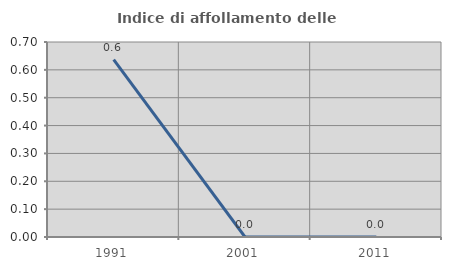
| Category | Indice di affollamento delle abitazioni  |
|---|---|
| 1991.0 | 0.637 |
| 2001.0 | 0 |
| 2011.0 | 0 |